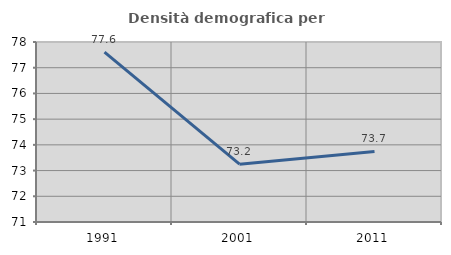
| Category | Densità demografica |
|---|---|
| 1991.0 | 77.603 |
| 2001.0 | 73.25 |
| 2011.0 | 73.743 |